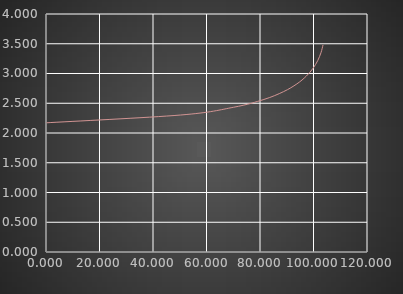
| Category | Series 1 |
|---|---|
| 0.0 | 2.171 |
| 50.27389063874594 | 2.302 |
| 70.15376591823104 | 2.433 |
| 81.46888074476179 | 2.564 |
| 88.7801885301243 | 2.695 |
| 93.79162204662774 | 2.826 |
| 97.32283428428747 | 2.956 |
| 99.82993495891019 | 3.087 |
| 101.59214418514145 | 3.218 |
| 102.79232080033492 | 3.349 |
| 103.55638139437777 | 3.48 |